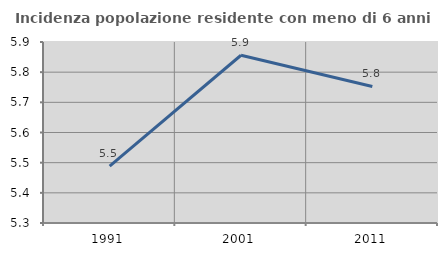
| Category | Incidenza popolazione residente con meno di 6 anni |
|---|---|
| 1991.0 | 5.489 |
| 2001.0 | 5.856 |
| 2011.0 | 5.753 |